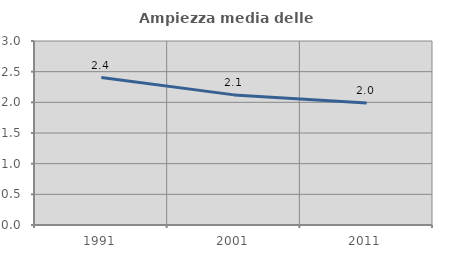
| Category | Ampiezza media delle famiglie |
|---|---|
| 1991.0 | 2.403 |
| 2001.0 | 2.122 |
| 2011.0 | 1.991 |